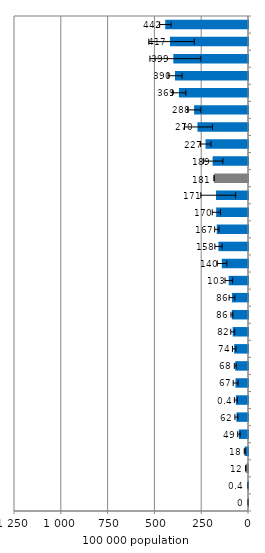
| Category | Series 0 |
|---|---|
| Korea, DPR | 442 |
| Papua New Guinea | 417 |
| Indonesia | 399 |
| Cambodia | 390 |
| Myanmar | 369 |
| Philippines | 288 |
| Pakistan | 270 |
| Bangladesh | 227 |
| Lao PDR | 189 |
| Asia-22 | 181.227 |
| Thailand | 171 |
| Mongolia | 170 |
| India | 167 |
| Nepal | 158 |
| Viet Nam | 140 |
| Malaysia | 103 |
| Solomon Islands | 86 |
| Korea, Rep. | 86 |
| Macao, China | 82 |
| Hong Kong, China | 74 |
| China | 68 |
| Fiji | 67 |
| Sri Lanka | 65 |
| Brunei Darussalam | 62 |
| Singapore | 49 |
| Japan | 18 |
| OECD | 12.003 |
| Australia | 1.5 |
| New Zealand | 0.34 |